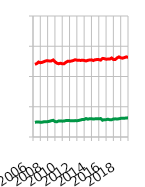
| Category | Vollzeit | Teilzeit |
|---|---|---|
| 2006.0 | 120100 | 24300 |
| 2006.0 | 121300 | 24900 |
| 2006.0 | 123900 | 24800 |
| 2006.0 | 122800 | 24400 |
| 2007.0 | 123400 | 24500 |
| 2007.0 | 124600 | 25200 |
| 2007.0 | 125800 | 25300 |
| 2007.0 | 126000 | 25400 |
| 2008.0 | 125600 | 26000 |
| 2008.0 | 125800 | 27000 |
| 2008.0 | 127300 | 27600 |
| 2008.0 | 124300 | 25500 |
| 2009.0 | 122100 | 25200 |
| 2009.0 | 121100 | 26500 |
| 2009.0 | 121900 | 26400 |
| 2009.0 | 121000 | 26200 |
| 2010.0 | 121200 | 26400 |
| 2010.0 | 123500 | 27200 |
| 2010.0 | 125300 | 27100 |
| 2010.0 | 125000 | 27100 |
| 2011.0 | 125600 | 26900 |
| 2011.0 | 126400 | 26800 |
| 2011.0 | 127700 | 27100 |
| 2011.0 | 127000 | 26900 |
| 2012.0 | 127000 | 27400 |
| 2012.0 | 126500 | 28100 |
| 2012.0 | 127000 | 29100 |
| 2012.0 | 126500 | 28900 |
| 2013.0 | 125700 | 30500 |
| 2013.0 | 126800 | 29500 |
| 2013.0 | 127300 | 30200 |
| 2013.0 | 127500 | 30100 |
| 2014.0 | 126400 | 29800 |
| 2014.0 | 127700 | 30000 |
| 2014.0 | 128000 | 30100 |
| 2014.0 | 127900 | 30100 |
| 2015.0 | 127100 | 30500 |
| 2015.0 | 129900 | 27700 |
| 2015.0 | 129500 | 28700 |
| 2015.0 | 128600 | 28700 |
| 2016.0 | 128800 | 29400 |
| 2016.0 | 128900 | 28500 |
| 2016.0 | 130600 | 28500 |
| 2016.0 | 128000 | 29800 |
| 2017.0 | 128200 | 30000 |
| 2017.0 | 130700 | 29600 |
| 2017.0 | 132400 | 30100 |
| 2017.0 | 130900 | 30800 |
| 2018.0 | 130300 | 31000 |
| 2018.0 | 131300 | 31100 |
| 2018.0 | 132400 | 31300 |
| 2018.0 | 131400 | 31700 |